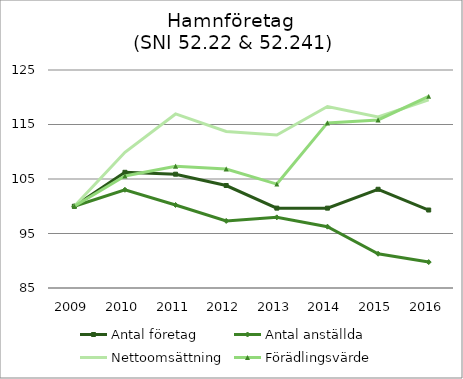
| Category | Antal företag | Antal anställda | Nettoomsättning | Förädlingsvärde |
|---|---|---|---|---|
| 2009.0 | 100 | 100 | 100 | 100 |
| 2010.0 | 106.228 | 103.02 | 109.902 | 105.559 |
| 2011.0 | 105.882 | 100.236 | 116.936 | 107.342 |
| 2012.0 | 103.806 | 97.308 | 113.725 | 106.839 |
| 2013.0 | 99.654 | 97.963 | 113.076 | 104.07 |
| 2014.0 | 99.654 | 96.253 | 118.297 | 115.293 |
| 2015.0 | 103.114 | 91.286 | 116.394 | 115.836 |
| 2016.0 | 99.308 | 89.758 | 119.507 | 120.166 |